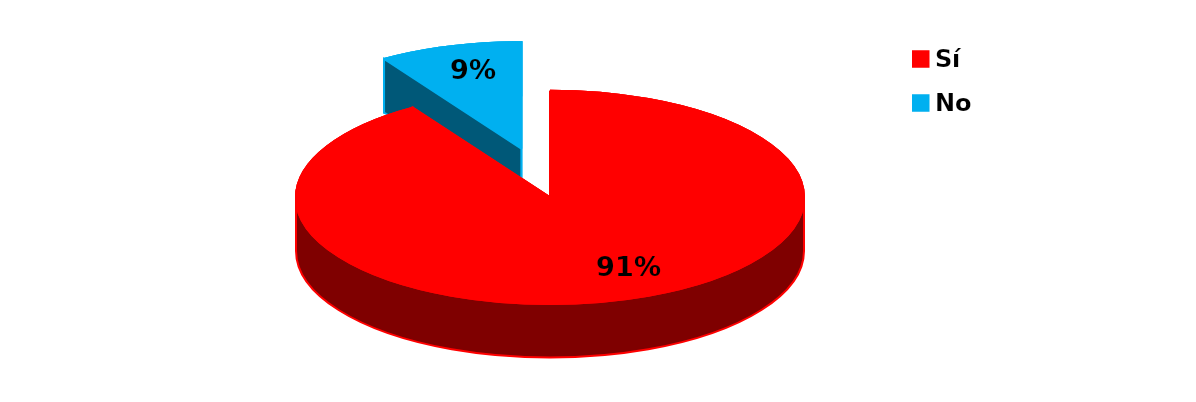
| Category | Series 0 |
|---|---|
| Sí | 20 |
| No | 2 |